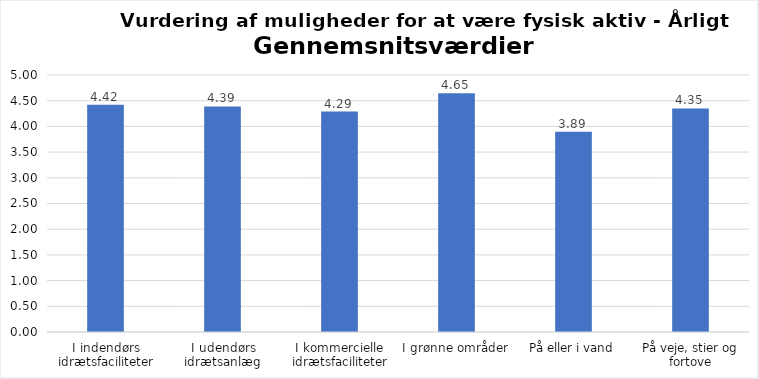
| Category | Gennemsnit |
|---|---|
| I indendørs idrætsfaciliteter | 4.421 |
| I udendørs idrætsanlæg | 4.388 |
| I kommercielle idrætsfaciliteter | 4.288 |
| I grønne områder | 4.646 |
| På eller i vand | 3.894 |
| På veje, stier og fortove | 4.35 |